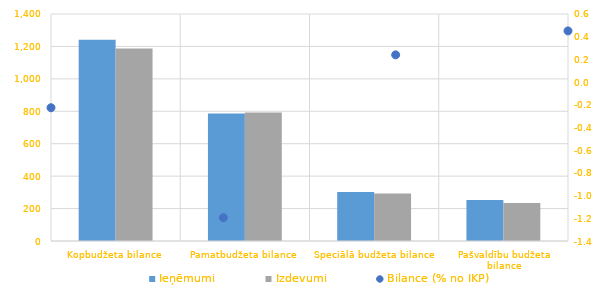
| Category | Ieņēmumi | Izdevumi |
|---|---|---|
| Kopbudžeta bilance | 1240480.294 | 1187341.457 |
| Pamatbudžeta bilance | 787062.79 | 792151.693 |
| Speciālā budžeta bilance | 302459.796 | 292908.695 |
| Pašvaldību budžeta bilance | 253268.686 | 234145.666 |